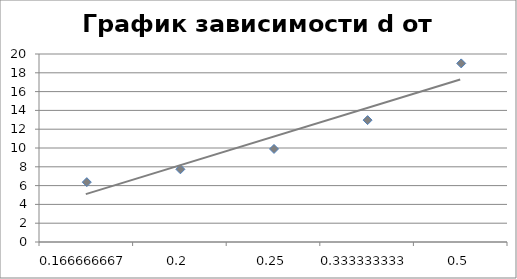
| Category | d |
|---|---|
| 0.16666666666666666 | 6.367 |
| 0.2 | 7.733 |
| 0.25 | 9.9 |
| 0.3333333333333333 | 12.967 |
| 0.5 | 19 |